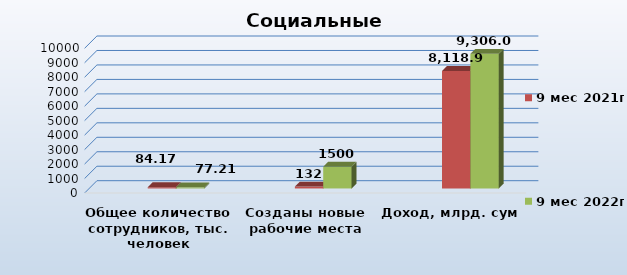
| Category | Series 0 | 9 мес 2021г | 9 мес 2022г |
|---|---|---|---|
| Общее количество сотрудников, тыс. человек |  | 84.17 | 77.213 |
| Созданы новые рабочие места |  | 132 | 1500 |
| Доход, млрд. сум |  | 8118.854 | 9306 |